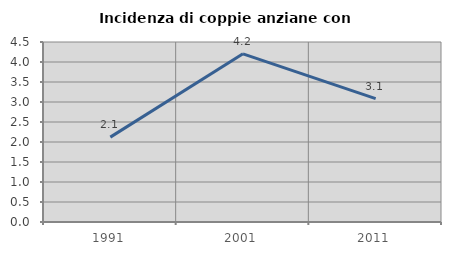
| Category | Incidenza di coppie anziane con figli |
|---|---|
| 1991.0 | 2.122 |
| 2001.0 | 4.204 |
| 2011.0 | 3.084 |